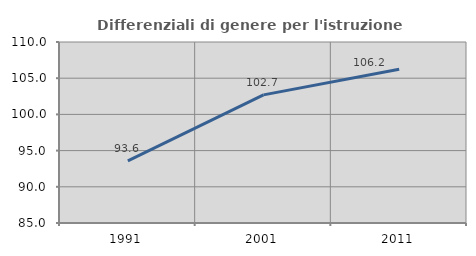
| Category | Differenziali di genere per l'istruzione superiore |
|---|---|
| 1991.0 | 93.591 |
| 2001.0 | 102.7 |
| 2011.0 | 106.249 |